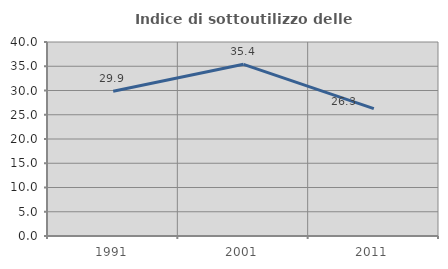
| Category | Indice di sottoutilizzo delle abitazioni  |
|---|---|
| 1991.0 | 29.856 |
| 2001.0 | 35.401 |
| 2011.0 | 26.275 |